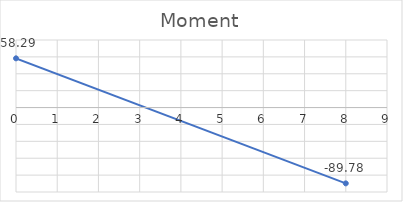
| Category | Series 0 |
|---|---|
| 0.0 | 58.286 |
| 8.0 | -89.777 |